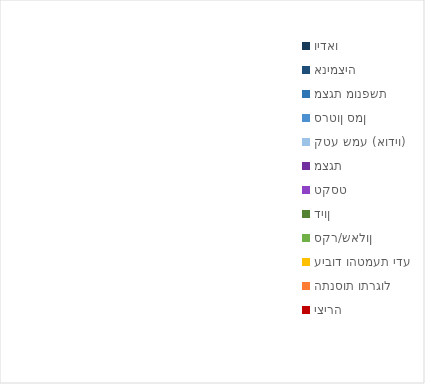
| Category | Series 0 |
|---|---|
| וידאו | 0 |
| אנימציה | 0 |
| מצגת מונפשת | 0 |
| סרטון סמן  | 0 |
| קטע שמע (אודיו) | 0 |
| מצגת | 0 |
| טקסט | 0 |
| דיון | 0 |
| סקר/שאלון | 0 |
| עיבוד והטמעת ידע | 0 |
| התנסות ותרגול | 0 |
| יצירה | 0 |